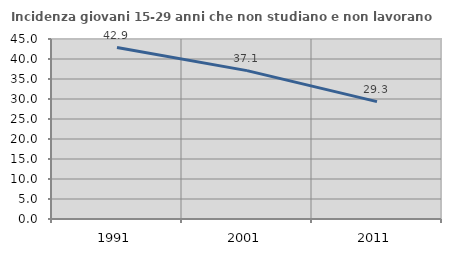
| Category | Incidenza giovani 15-29 anni che non studiano e non lavorano  |
|---|---|
| 1991.0 | 42.857 |
| 2001.0 | 37.099 |
| 2011.0 | 29.334 |